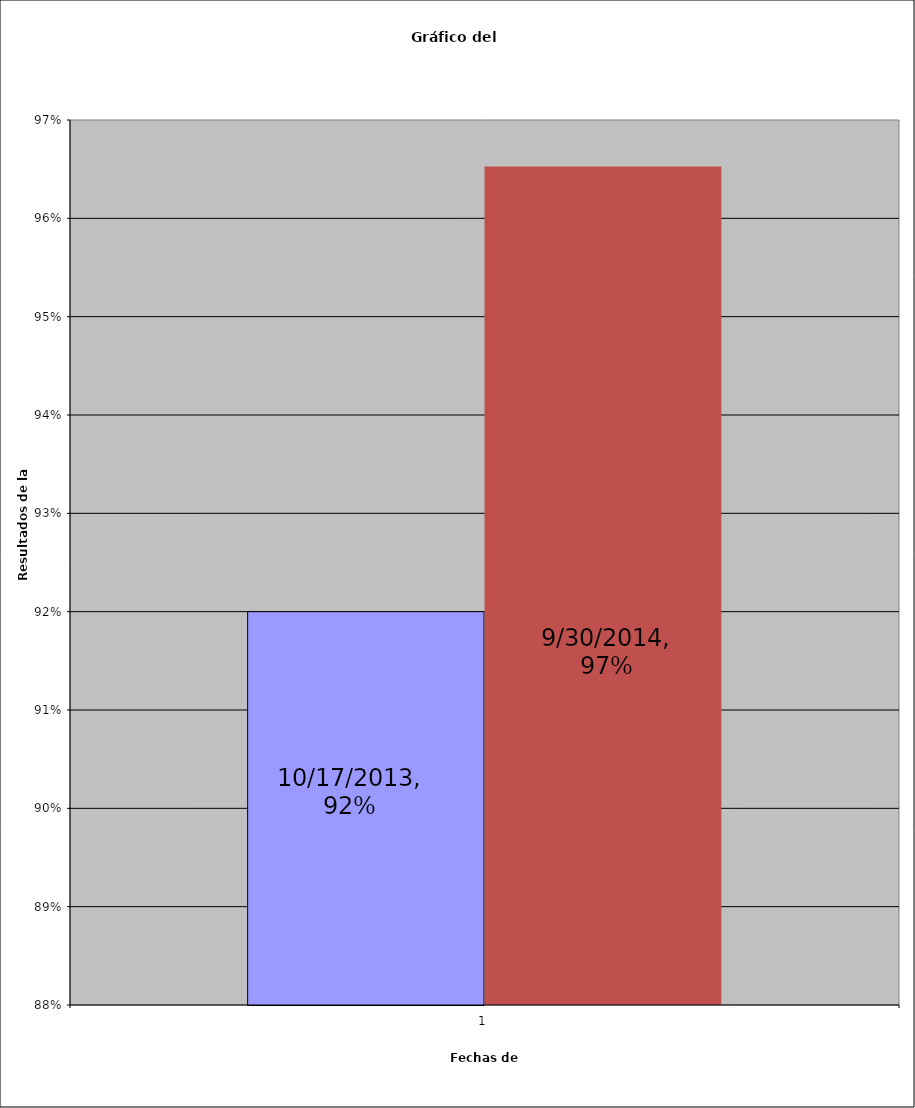
| Category | 17/10/2013 | 30/09/2014 |
|---|---|---|
| 0 | 0.92 | 0.965 |